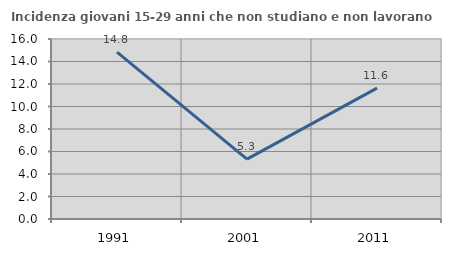
| Category | Incidenza giovani 15-29 anni che non studiano e non lavorano  |
|---|---|
| 1991.0 | 14.836 |
| 2001.0 | 5.319 |
| 2011.0 | 11.628 |